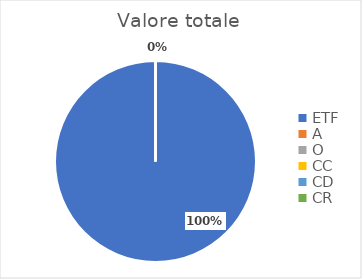
| Category | Valore totale |
|---|---|
| ETF | 3827.55 |
| A | 0 |
| O | 0 |
| CC | 0 |
| CD | 0 |
| CR | 0 |